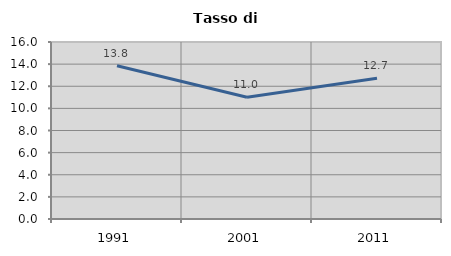
| Category | Tasso di disoccupazione   |
|---|---|
| 1991.0 | 13.846 |
| 2001.0 | 11 |
| 2011.0 | 12.731 |